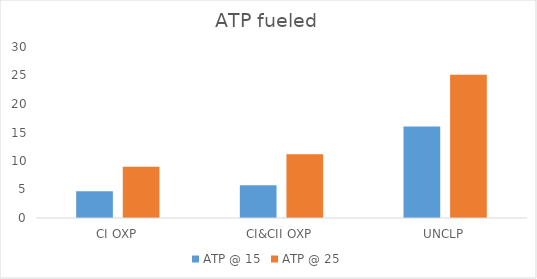
| Category | ATP @ 15 | ATP @ 25 |
|---|---|---|
| CI OXP | 4.692 | 8.992 |
| CI&CII OXP | 5.736 | 11.192 |
| UNCLP | 16.071 | 25.122 |